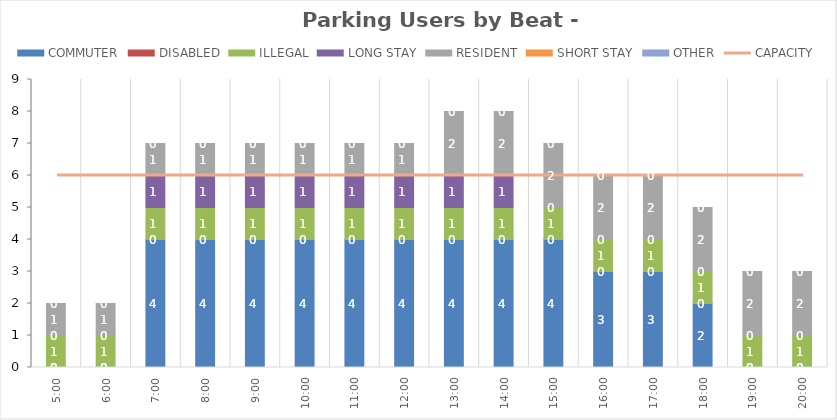
| Category | COMMUTER | DISABLED | ILLEGAL | LONG STAY | RESIDENT | SHORT STAY | OTHER |
|---|---|---|---|---|---|---|---|
| 0.20833333333333334 | 0 | 0 | 1 | 0 | 1 | 0 | 0 |
| 0.25 | 0 | 0 | 1 | 0 | 1 | 0 | 0 |
| 0.2916666666666667 | 4 | 0 | 1 | 1 | 1 | 0 | 0 |
| 0.3333333333333333 | 4 | 0 | 1 | 1 | 1 | 0 | 0 |
| 0.375 | 4 | 0 | 1 | 1 | 1 | 0 | 0 |
| 0.4166666666666667 | 4 | 0 | 1 | 1 | 1 | 0 | 0 |
| 0.4583333333333333 | 4 | 0 | 1 | 1 | 1 | 0 | 0 |
| 0.5 | 4 | 0 | 1 | 1 | 1 | 0 | 0 |
| 0.5416666666666666 | 4 | 0 | 1 | 1 | 2 | 0 | 0 |
| 0.5833333333333334 | 4 | 0 | 1 | 1 | 2 | 0 | 0 |
| 0.625 | 4 | 0 | 1 | 0 | 2 | 0 | 0 |
| 0.6666666666666666 | 3 | 0 | 1 | 0 | 2 | 0 | 0 |
| 0.7083333333333334 | 3 | 0 | 1 | 0 | 2 | 0 | 0 |
| 0.75 | 2 | 0 | 1 | 0 | 2 | 0 | 0 |
| 0.7916666666666666 | 0 | 0 | 1 | 0 | 2 | 0 | 0 |
| 0.8333333333333334 | 0 | 0 | 1 | 0 | 2 | 0 | 0 |